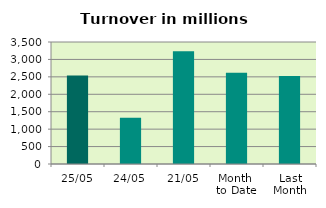
| Category | Series 0 |
|---|---|
| 25/05 | 2535.798 |
| 24/05 | 1325.216 |
| 21/05 | 3236.132 |
| Month 
to Date | 2619.629 |
| Last
Month | 2525.558 |